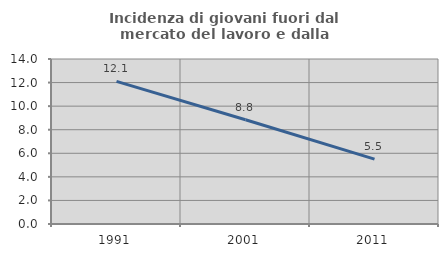
| Category | Incidenza di giovani fuori dal mercato del lavoro e dalla formazione  |
|---|---|
| 1991.0 | 12.102 |
| 2001.0 | 8.85 |
| 2011.0 | 5.505 |